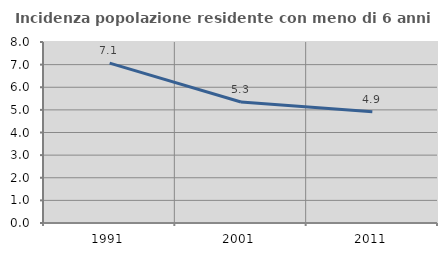
| Category | Incidenza popolazione residente con meno di 6 anni |
|---|---|
| 1991.0 | 7.065 |
| 2001.0 | 5.349 |
| 2011.0 | 4.917 |